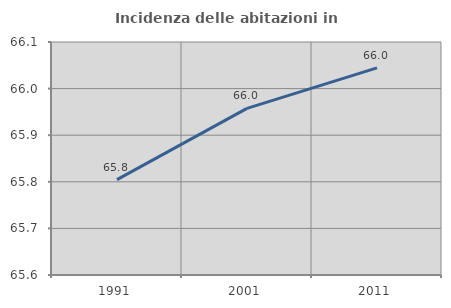
| Category | Incidenza delle abitazioni in proprietà  |
|---|---|
| 1991.0 | 65.805 |
| 2001.0 | 65.957 |
| 2011.0 | 66.044 |